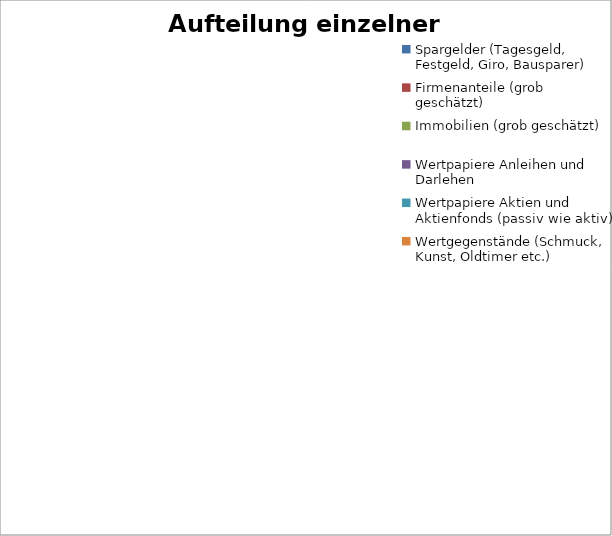
| Category | Series 0 |
|---|---|
| Spargelder (Tagesgeld, Festgeld, Giro, Bausparer) | 0 |
| Firmenanteile (grob geschätzt)  | 0 |
| Immobilien (grob geschätzt) | 0 |
| Wertpapiere Anleihen und Darlehen | 0 |
| Wertpapiere Aktien und Aktienfonds (passiv wie aktiv) | 0 |
| Wertgegenstände (Schmuck, Kunst, Oldtimer etc.) | 0 |
| Edelmetalle/Rohstoffe | 0 |